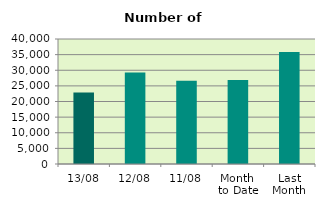
| Category | Series 0 |
|---|---|
| 13/08 | 22864 |
| 12/08 | 29304 |
| 11/08 | 26672 |
| Month 
to Date | 26872.6 |
| Last
Month | 35875.545 |